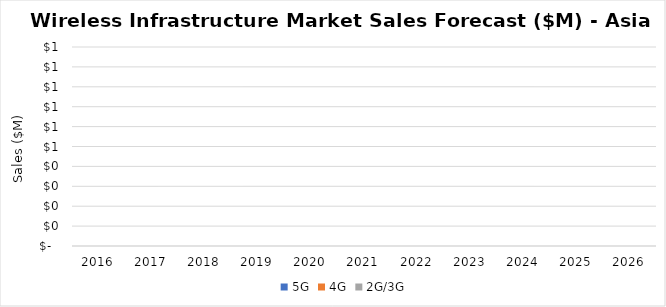
| Category | 5G | 4G | 2G/3G |
|---|---|---|---|
| 2016.0 | 0 | 0 | 0 |
| 2017.0 | 0 | 0 | 0 |
| 2018.0 | 0 | 0 | 0 |
| 2019.0 | 0 | 0 | 0 |
| 2020.0 | 0 | 0 | 0 |
| 2021.0 | 0 | 0 | 0 |
| 2022.0 | 0 | 0 | 0 |
| 2023.0 | 0 | 0 | 0 |
| 2024.0 | 0 | 0 | 0 |
| 2025.0 | 0 | 0 | 0 |
| 2026.0 | 0 | 0 | 0 |